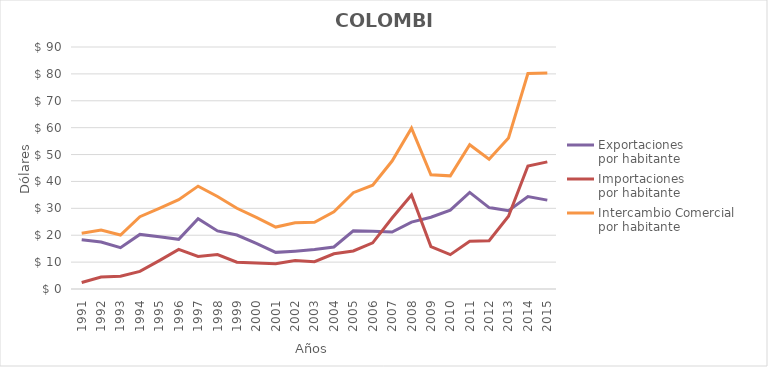
| Category | Exportaciones 
por habitante | Importaciones 
por habitante | Intercambio Comercial  
por habitante |
|---|---|---|---|
| 1991.0 | 18.291 | 2.411 | 20.702 |
| 1992.0 | 17.484 | 4.434 | 21.918 |
| 1993.0 | 15.35 | 4.728 | 20.077 |
| 1994.0 | 20.301 | 6.569 | 26.87 |
| 1995.0 | 19.455 | 10.55 | 30.005 |
| 1996.0 | 18.477 | 14.741 | 33.218 |
| 1997.0 | 26.161 | 12.093 | 38.254 |
| 1998.0 | 21.593 | 12.828 | 34.421 |
| 1999.0 | 20.075 | 9.958 | 30.033 |
| 2000.0 | 16.933 | 9.67 | 26.603 |
| 2001.0 | 13.622 | 9.41 | 23.033 |
| 2002.0 | 14.063 | 10.578 | 24.641 |
| 2003.0 | 14.66 | 10.15 | 24.81 |
| 2004.0 | 15.627 | 13.105 | 28.731 |
| 2005.0 | 21.666 | 14.149 | 35.815 |
| 2006.0 | 21.437 | 17.151 | 38.588 |
| 2007.0 | 21.198 | 26.39 | 47.588 |
| 2008.0 | 24.856 | 34.953 | 59.809 |
| 2009.0 | 26.672 | 15.78 | 42.452 |
| 2010.0 | 29.298 | 12.785 | 42.083 |
| 2011.0 | 35.931 | 17.725 | 53.657 |
| 2012.0 | 30.276 | 17.978 | 48.254 |
| 2013.0 | 29.113 | 27.065 | 56.178 |
| 2014.0 | 34.38 | 45.733 | 80.112 |
| 2015.0 | 33.055 | 47.273 | 80.328 |